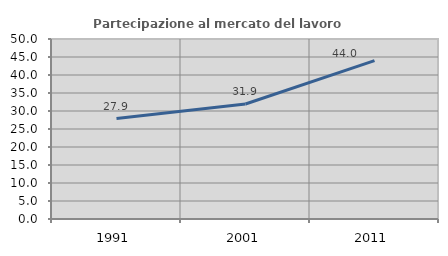
| Category | Partecipazione al mercato del lavoro  femminile |
|---|---|
| 1991.0 | 27.895 |
| 2001.0 | 31.944 |
| 2011.0 | 44.009 |